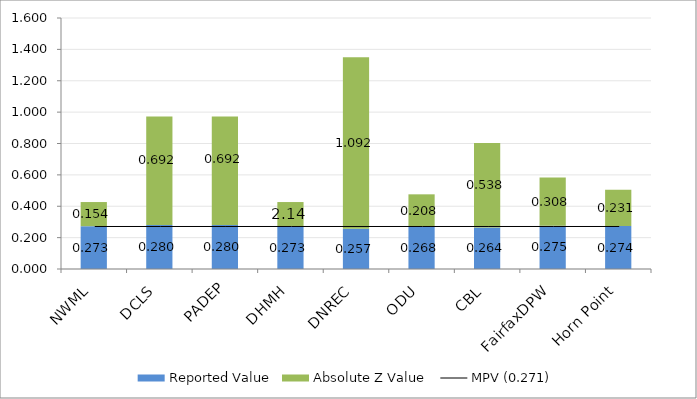
| Category | Reported Value | Absolute Z Value  |
|---|---|---|
| NWML | 0.273 | 0.154 |
| DCLS | 0.28 | 0.692 |
| PADEP | 0.28 | 0.692 |
| DHMH | 0.273 | 0.154 |
| DNREC | 0.257 | 1.092 |
| ODU | 0.268 | 0.208 |
| CBL | 0.264 | 0.538 |
| FairfaxDPW | 0.275 | 0.308 |
| Horn Point | 0.274 | 0.231 |